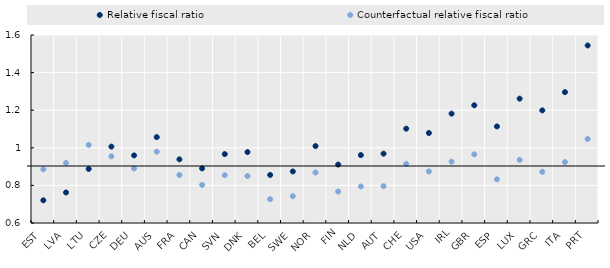
| Category | Relative fiscal ratio | Counterfactual relative fiscal ratio |
|---|---|---|
| EST | 0.721 | 0.886 |
| LVA | 0.762 | 0.919 |
| LTU | 0.887 | 1.015 |
| CZE | 1.006 | 0.954 |
| DEU | 0.96 | 0.89 |
| AUS | 1.057 | 0.979 |
| FRA | 0.938 | 0.856 |
| CAN | 0.89 | 0.803 |
| SVN | 0.966 | 0.854 |
| DNK | 0.977 | 0.85 |
| BEL | 0.856 | 0.727 |
| SWE | 0.874 | 0.743 |
| NOR | 1.009 | 0.869 |
| FIN | 0.911 | 0.767 |
| NLD | 0.961 | 0.794 |
| AUT | 0.969 | 0.796 |
| CHE | 1.102 | 0.915 |
| USA | 1.079 | 0.874 |
| IRL | 1.182 | 0.926 |
| GBR | 1.226 | 0.965 |
| ESP | 1.114 | 0.832 |
| LUX | 1.261 | 0.936 |
| GRC | 1.199 | 0.872 |
| ITA | 1.296 | 0.924 |
| PRT | 1.544 | 1.047 |